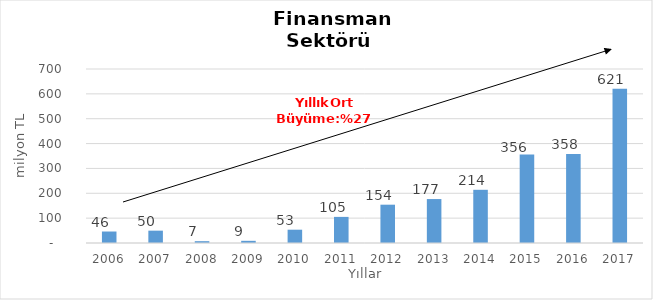
| Category | Finansman |
|---|---|
| 2006.0 | 46.209 |
| 2007.0 | 49.659 |
| 2008.0 | 7.339 |
| 2009.0 | 8.77 |
| 2010.0 | 53.492 |
| 2011.0 | 105.032 |
| 2012.0 | 154.13 |
| 2013.0 | 176.798 |
| 2014.0 | 214.053 |
| 2015.0 | 356 |
| 2016.0 | 358 |
| 2017.0 | 621 |